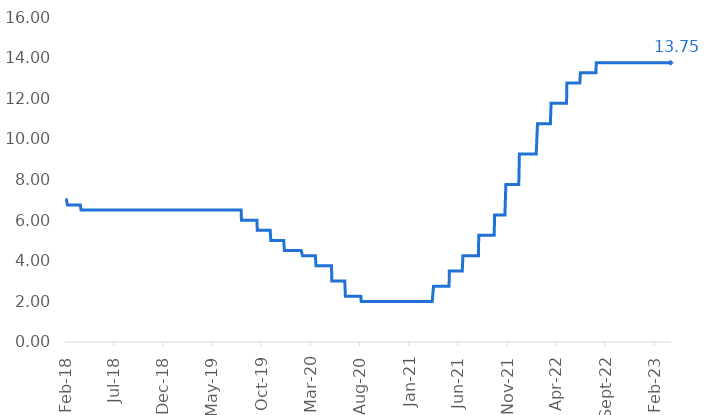
| Category | Selic |
|---|---|
| 2018-02-01 | 7 |
| 2018-02-02 | 7 |
| 2018-02-03 | 7 |
| 2018-02-04 | 7 |
| 2018-02-05 | 7 |
| 2018-02-06 | 7 |
| 2018-02-07 | 7 |
| 2018-02-08 | 6.75 |
| 2018-02-09 | 6.75 |
| 2018-02-10 | 6.75 |
| 2018-02-11 | 6.75 |
| 2018-02-12 | 6.75 |
| 2018-02-13 | 6.75 |
| 2018-02-14 | 6.75 |
| 2018-02-15 | 6.75 |
| 2018-02-16 | 6.75 |
| 2018-02-17 | 6.75 |
| 2018-02-18 | 6.75 |
| 2018-02-19 | 6.75 |
| 2018-02-20 | 6.75 |
| 2018-02-21 | 6.75 |
| 2018-02-22 | 6.75 |
| 2018-02-23 | 6.75 |
| 2018-02-24 | 6.75 |
| 2018-02-25 | 6.75 |
| 2018-02-26 | 6.75 |
| 2018-02-27 | 6.75 |
| 2018-02-28 | 6.75 |
| 2018-03-01 | 6.75 |
| 2018-03-02 | 6.75 |
| 2018-03-03 | 6.75 |
| 2018-03-04 | 6.75 |
| 2018-03-05 | 6.75 |
| 2018-03-06 | 6.75 |
| 2018-03-07 | 6.75 |
| 2018-03-08 | 6.75 |
| 2018-03-09 | 6.75 |
| 2018-03-10 | 6.75 |
| 2018-03-11 | 6.75 |
| 2018-03-12 | 6.75 |
| 2018-03-13 | 6.75 |
| 2018-03-14 | 6.75 |
| 2018-03-15 | 6.75 |
| 2018-03-16 | 6.75 |
| 2018-03-17 | 6.75 |
| 2018-03-18 | 6.75 |
| 2018-03-19 | 6.75 |
| 2018-03-20 | 6.75 |
| 2018-03-21 | 6.75 |
| 2018-03-22 | 6.5 |
| 2018-03-23 | 6.5 |
| 2018-03-24 | 6.5 |
| 2018-03-25 | 6.5 |
| 2018-03-26 | 6.5 |
| 2018-03-27 | 6.5 |
| 2018-03-28 | 6.5 |
| 2018-03-29 | 6.5 |
| 2018-03-30 | 6.5 |
| 2018-03-31 | 6.5 |
| 2018-04-01 | 6.5 |
| 2018-04-02 | 6.5 |
| 2018-04-03 | 6.5 |
| 2018-04-04 | 6.5 |
| 2018-04-05 | 6.5 |
| 2018-04-06 | 6.5 |
| 2018-04-07 | 6.5 |
| 2018-04-08 | 6.5 |
| 2018-04-09 | 6.5 |
| 2018-04-10 | 6.5 |
| 2018-04-11 | 6.5 |
| 2018-04-12 | 6.5 |
| 2018-04-13 | 6.5 |
| 2018-04-14 | 6.5 |
| 2018-04-15 | 6.5 |
| 2018-04-16 | 6.5 |
| 2018-04-17 | 6.5 |
| 2018-04-18 | 6.5 |
| 2018-04-19 | 6.5 |
| 2018-04-20 | 6.5 |
| 2018-04-21 | 6.5 |
| 2018-04-22 | 6.5 |
| 2018-04-23 | 6.5 |
| 2018-04-24 | 6.5 |
| 2018-04-25 | 6.5 |
| 2018-04-26 | 6.5 |
| 2018-04-27 | 6.5 |
| 2018-04-28 | 6.5 |
| 2018-04-29 | 6.5 |
| 2018-04-30 | 6.5 |
| 2018-05-01 | 6.5 |
| 2018-05-02 | 6.5 |
| 2018-05-03 | 6.5 |
| 2018-05-04 | 6.5 |
| 2018-05-05 | 6.5 |
| 2018-05-06 | 6.5 |
| 2018-05-07 | 6.5 |
| 2018-05-08 | 6.5 |
| 2018-05-09 | 6.5 |
| 2018-05-10 | 6.5 |
| 2018-05-11 | 6.5 |
| 2018-05-12 | 6.5 |
| 2018-05-13 | 6.5 |
| 2018-05-14 | 6.5 |
| 2018-05-15 | 6.5 |
| 2018-05-16 | 6.5 |
| 2018-05-17 | 6.5 |
| 2018-05-18 | 6.5 |
| 2018-05-19 | 6.5 |
| 2018-05-20 | 6.5 |
| 2018-05-21 | 6.5 |
| 2018-05-22 | 6.5 |
| 2018-05-23 | 6.5 |
| 2018-05-24 | 6.5 |
| 2018-05-25 | 6.5 |
| 2018-05-26 | 6.5 |
| 2018-05-27 | 6.5 |
| 2018-05-28 | 6.5 |
| 2018-05-29 | 6.5 |
| 2018-05-30 | 6.5 |
| 2018-05-31 | 6.5 |
| 2018-06-01 | 6.5 |
| 2018-06-02 | 6.5 |
| 2018-06-03 | 6.5 |
| 2018-06-04 | 6.5 |
| 2018-06-05 | 6.5 |
| 2018-06-06 | 6.5 |
| 2018-06-07 | 6.5 |
| 2018-06-08 | 6.5 |
| 2018-06-09 | 6.5 |
| 2018-06-10 | 6.5 |
| 2018-06-11 | 6.5 |
| 2018-06-12 | 6.5 |
| 2018-06-13 | 6.5 |
| 2018-06-14 | 6.5 |
| 2018-06-15 | 6.5 |
| 2018-06-16 | 6.5 |
| 2018-06-17 | 6.5 |
| 2018-06-18 | 6.5 |
| 2018-06-19 | 6.5 |
| 2018-06-20 | 6.5 |
| 2018-06-21 | 6.5 |
| 2018-06-22 | 6.5 |
| 2018-06-23 | 6.5 |
| 2018-06-24 | 6.5 |
| 2018-06-25 | 6.5 |
| 2018-06-26 | 6.5 |
| 2018-06-27 | 6.5 |
| 2018-06-28 | 6.5 |
| 2018-06-29 | 6.5 |
| 2018-06-30 | 6.5 |
| 2018-07-01 | 6.5 |
| 2018-07-02 | 6.5 |
| 2018-07-03 | 6.5 |
| 2018-07-04 | 6.5 |
| 2018-07-05 | 6.5 |
| 2018-07-06 | 6.5 |
| 2018-07-07 | 6.5 |
| 2018-07-08 | 6.5 |
| 2018-07-09 | 6.5 |
| 2018-07-10 | 6.5 |
| 2018-07-11 | 6.5 |
| 2018-07-12 | 6.5 |
| 2018-07-13 | 6.5 |
| 2018-07-14 | 6.5 |
| 2018-07-15 | 6.5 |
| 2018-07-16 | 6.5 |
| 2018-07-17 | 6.5 |
| 2018-07-18 | 6.5 |
| 2018-07-19 | 6.5 |
| 2018-07-20 | 6.5 |
| 2018-07-21 | 6.5 |
| 2018-07-22 | 6.5 |
| 2018-07-23 | 6.5 |
| 2018-07-24 | 6.5 |
| 2018-07-25 | 6.5 |
| 2018-07-26 | 6.5 |
| 2018-07-27 | 6.5 |
| 2018-07-28 | 6.5 |
| 2018-07-29 | 6.5 |
| 2018-07-30 | 6.5 |
| 2018-07-31 | 6.5 |
| 2018-08-01 | 6.5 |
| 2018-08-02 | 6.5 |
| 2018-08-03 | 6.5 |
| 2018-08-04 | 6.5 |
| 2018-08-05 | 6.5 |
| 2018-08-06 | 6.5 |
| 2018-08-07 | 6.5 |
| 2018-08-08 | 6.5 |
| 2018-08-09 | 6.5 |
| 2018-08-10 | 6.5 |
| 2018-08-11 | 6.5 |
| 2018-08-12 | 6.5 |
| 2018-08-13 | 6.5 |
| 2018-08-14 | 6.5 |
| 2018-08-15 | 6.5 |
| 2018-08-16 | 6.5 |
| 2018-08-17 | 6.5 |
| 2018-08-18 | 6.5 |
| 2018-08-19 | 6.5 |
| 2018-08-20 | 6.5 |
| 2018-08-21 | 6.5 |
| 2018-08-22 | 6.5 |
| 2018-08-23 | 6.5 |
| 2018-08-24 | 6.5 |
| 2018-08-25 | 6.5 |
| 2018-08-26 | 6.5 |
| 2018-08-27 | 6.5 |
| 2018-08-28 | 6.5 |
| 2018-08-29 | 6.5 |
| 2018-08-30 | 6.5 |
| 2018-08-31 | 6.5 |
| 2018-09-01 | 6.5 |
| 2018-09-02 | 6.5 |
| 2018-09-03 | 6.5 |
| 2018-09-04 | 6.5 |
| 2018-09-05 | 6.5 |
| 2018-09-06 | 6.5 |
| 2018-09-07 | 6.5 |
| 2018-09-08 | 6.5 |
| 2018-09-09 | 6.5 |
| 2018-09-10 | 6.5 |
| 2018-09-11 | 6.5 |
| 2018-09-12 | 6.5 |
| 2018-09-13 | 6.5 |
| 2018-09-14 | 6.5 |
| 2018-09-15 | 6.5 |
| 2018-09-16 | 6.5 |
| 2018-09-17 | 6.5 |
| 2018-09-18 | 6.5 |
| 2018-09-19 | 6.5 |
| 2018-09-20 | 6.5 |
| 2018-09-21 | 6.5 |
| 2018-09-22 | 6.5 |
| 2018-09-23 | 6.5 |
| 2018-09-24 | 6.5 |
| 2018-09-25 | 6.5 |
| 2018-09-26 | 6.5 |
| 2018-09-27 | 6.5 |
| 2018-09-28 | 6.5 |
| 2018-09-29 | 6.5 |
| 2018-09-30 | 6.5 |
| 2018-10-01 | 6.5 |
| 2018-10-02 | 6.5 |
| 2018-10-03 | 6.5 |
| 2018-10-04 | 6.5 |
| 2018-10-05 | 6.5 |
| 2018-10-06 | 6.5 |
| 2018-10-07 | 6.5 |
| 2018-10-08 | 6.5 |
| 2018-10-09 | 6.5 |
| 2018-10-10 | 6.5 |
| 2018-10-11 | 6.5 |
| 2018-10-12 | 6.5 |
| 2018-10-13 | 6.5 |
| 2018-10-14 | 6.5 |
| 2018-10-15 | 6.5 |
| 2018-10-16 | 6.5 |
| 2018-10-17 | 6.5 |
| 2018-10-18 | 6.5 |
| 2018-10-19 | 6.5 |
| 2018-10-20 | 6.5 |
| 2018-10-21 | 6.5 |
| 2018-10-22 | 6.5 |
| 2018-10-23 | 6.5 |
| 2018-10-24 | 6.5 |
| 2018-10-25 | 6.5 |
| 2018-10-26 | 6.5 |
| 2018-10-27 | 6.5 |
| 2018-10-28 | 6.5 |
| 2018-10-29 | 6.5 |
| 2018-10-30 | 6.5 |
| 2018-10-31 | 6.5 |
| 2018-11-01 | 6.5 |
| 2018-11-02 | 6.5 |
| 2018-11-03 | 6.5 |
| 2018-11-04 | 6.5 |
| 2018-11-05 | 6.5 |
| 2018-11-06 | 6.5 |
| 2018-11-07 | 6.5 |
| 2018-11-08 | 6.5 |
| 2018-11-09 | 6.5 |
| 2018-11-10 | 6.5 |
| 2018-11-11 | 6.5 |
| 2018-11-12 | 6.5 |
| 2018-11-13 | 6.5 |
| 2018-11-14 | 6.5 |
| 2018-11-15 | 6.5 |
| 2018-11-16 | 6.5 |
| 2018-11-17 | 6.5 |
| 2018-11-18 | 6.5 |
| 2018-11-19 | 6.5 |
| 2018-11-20 | 6.5 |
| 2018-11-21 | 6.5 |
| 2018-11-22 | 6.5 |
| 2018-11-23 | 6.5 |
| 2018-11-24 | 6.5 |
| 2018-11-25 | 6.5 |
| 2018-11-26 | 6.5 |
| 2018-11-27 | 6.5 |
| 2018-11-28 | 6.5 |
| 2018-11-29 | 6.5 |
| 2018-11-30 | 6.5 |
| 2018-12-01 | 6.5 |
| 2018-12-02 | 6.5 |
| 2018-12-03 | 6.5 |
| 2018-12-04 | 6.5 |
| 2018-12-05 | 6.5 |
| 2018-12-06 | 6.5 |
| 2018-12-07 | 6.5 |
| 2018-12-08 | 6.5 |
| 2018-12-09 | 6.5 |
| 2018-12-10 | 6.5 |
| 2018-12-11 | 6.5 |
| 2018-12-12 | 6.5 |
| 2018-12-13 | 6.5 |
| 2018-12-14 | 6.5 |
| 2018-12-15 | 6.5 |
| 2018-12-16 | 6.5 |
| 2018-12-17 | 6.5 |
| 2018-12-18 | 6.5 |
| 2018-12-19 | 6.5 |
| 2018-12-20 | 6.5 |
| 2018-12-21 | 6.5 |
| 2018-12-22 | 6.5 |
| 2018-12-23 | 6.5 |
| 2018-12-24 | 6.5 |
| 2018-12-25 | 6.5 |
| 2018-12-26 | 6.5 |
| 2018-12-27 | 6.5 |
| 2018-12-28 | 6.5 |
| 2018-12-29 | 6.5 |
| 2018-12-30 | 6.5 |
| 2018-12-31 | 6.5 |
| 2019-01-01 | 6.5 |
| 2019-01-02 | 6.5 |
| 2019-01-03 | 6.5 |
| 2019-01-04 | 6.5 |
| 2019-01-05 | 6.5 |
| 2019-01-06 | 6.5 |
| 2019-01-07 | 6.5 |
| 2019-01-08 | 6.5 |
| 2019-01-09 | 6.5 |
| 2019-01-10 | 6.5 |
| 2019-01-11 | 6.5 |
| 2019-01-12 | 6.5 |
| 2019-01-13 | 6.5 |
| 2019-01-14 | 6.5 |
| 2019-01-15 | 6.5 |
| 2019-01-16 | 6.5 |
| 2019-01-17 | 6.5 |
| 2019-01-18 | 6.5 |
| 2019-01-19 | 6.5 |
| 2019-01-20 | 6.5 |
| 2019-01-21 | 6.5 |
| 2019-01-22 | 6.5 |
| 2019-01-23 | 6.5 |
| 2019-01-24 | 6.5 |
| 2019-01-25 | 6.5 |
| 2019-01-26 | 6.5 |
| 2019-01-27 | 6.5 |
| 2019-01-28 | 6.5 |
| 2019-01-29 | 6.5 |
| 2019-01-30 | 6.5 |
| 2019-01-31 | 6.5 |
| 2019-02-01 | 6.5 |
| 2019-02-02 | 6.5 |
| 2019-02-03 | 6.5 |
| 2019-02-04 | 6.5 |
| 2019-02-05 | 6.5 |
| 2019-02-06 | 6.5 |
| 2019-02-07 | 6.5 |
| 2019-02-08 | 6.5 |
| 2019-02-09 | 6.5 |
| 2019-02-10 | 6.5 |
| 2019-02-11 | 6.5 |
| 2019-02-12 | 6.5 |
| 2019-02-13 | 6.5 |
| 2019-02-14 | 6.5 |
| 2019-02-15 | 6.5 |
| 2019-02-16 | 6.5 |
| 2019-02-17 | 6.5 |
| 2019-02-18 | 6.5 |
| 2019-02-19 | 6.5 |
| 2019-02-20 | 6.5 |
| 2019-02-21 | 6.5 |
| 2019-02-22 | 6.5 |
| 2019-02-23 | 6.5 |
| 2019-02-24 | 6.5 |
| 2019-02-25 | 6.5 |
| 2019-02-26 | 6.5 |
| 2019-02-27 | 6.5 |
| 2019-02-28 | 6.5 |
| 2019-03-01 | 6.5 |
| 2019-03-02 | 6.5 |
| 2019-03-03 | 6.5 |
| 2019-03-04 | 6.5 |
| 2019-03-05 | 6.5 |
| 2019-03-06 | 6.5 |
| 2019-03-07 | 6.5 |
| 2019-03-08 | 6.5 |
| 2019-03-09 | 6.5 |
| 2019-03-10 | 6.5 |
| 2019-03-11 | 6.5 |
| 2019-03-12 | 6.5 |
| 2019-03-13 | 6.5 |
| 2019-03-14 | 6.5 |
| 2019-03-15 | 6.5 |
| 2019-03-16 | 6.5 |
| 2019-03-17 | 6.5 |
| 2019-03-18 | 6.5 |
| 2019-03-19 | 6.5 |
| 2019-03-20 | 6.5 |
| 2019-03-21 | 6.5 |
| 2019-03-22 | 6.5 |
| 2019-03-23 | 6.5 |
| 2019-03-24 | 6.5 |
| 2019-03-25 | 6.5 |
| 2019-03-26 | 6.5 |
| 2019-03-27 | 6.5 |
| 2019-03-28 | 6.5 |
| 2019-03-29 | 6.5 |
| 2019-03-30 | 6.5 |
| 2019-03-31 | 6.5 |
| 2019-04-01 | 6.5 |
| 2019-04-02 | 6.5 |
| 2019-04-03 | 6.5 |
| 2019-04-04 | 6.5 |
| 2019-04-05 | 6.5 |
| 2019-04-06 | 6.5 |
| 2019-04-07 | 6.5 |
| 2019-04-08 | 6.5 |
| 2019-04-09 | 6.5 |
| 2019-04-10 | 6.5 |
| 2019-04-11 | 6.5 |
| 2019-04-12 | 6.5 |
| 2019-04-13 | 6.5 |
| 2019-04-14 | 6.5 |
| 2019-04-15 | 6.5 |
| 2019-04-16 | 6.5 |
| 2019-04-17 | 6.5 |
| 2019-04-18 | 6.5 |
| 2019-04-19 | 6.5 |
| 2019-04-20 | 6.5 |
| 2019-04-21 | 6.5 |
| 2019-04-22 | 6.5 |
| 2019-04-23 | 6.5 |
| 2019-04-24 | 6.5 |
| 2019-04-25 | 6.5 |
| 2019-04-26 | 6.5 |
| 2019-04-27 | 6.5 |
| 2019-04-28 | 6.5 |
| 2019-04-29 | 6.5 |
| 2019-04-30 | 6.5 |
| 2019-05-01 | 6.5 |
| 2019-05-02 | 6.5 |
| 2019-05-03 | 6.5 |
| 2019-05-04 | 6.5 |
| 2019-05-05 | 6.5 |
| 2019-05-06 | 6.5 |
| 2019-05-07 | 6.5 |
| 2019-05-08 | 6.5 |
| 2019-05-09 | 6.5 |
| 2019-05-10 | 6.5 |
| 2019-05-11 | 6.5 |
| 2019-05-12 | 6.5 |
| 2019-05-13 | 6.5 |
| 2019-05-14 | 6.5 |
| 2019-05-15 | 6.5 |
| 2019-05-16 | 6.5 |
| 2019-05-17 | 6.5 |
| 2019-05-18 | 6.5 |
| 2019-05-19 | 6.5 |
| 2019-05-20 | 6.5 |
| 2019-05-21 | 6.5 |
| 2019-05-22 | 6.5 |
| 2019-05-23 | 6.5 |
| 2019-05-24 | 6.5 |
| 2019-05-25 | 6.5 |
| 2019-05-26 | 6.5 |
| 2019-05-27 | 6.5 |
| 2019-05-28 | 6.5 |
| 2019-05-29 | 6.5 |
| 2019-05-30 | 6.5 |
| 2019-05-31 | 6.5 |
| 2019-06-01 | 6.5 |
| 2019-06-02 | 6.5 |
| 2019-06-03 | 6.5 |
| 2019-06-04 | 6.5 |
| 2019-06-05 | 6.5 |
| 2019-06-06 | 6.5 |
| 2019-06-07 | 6.5 |
| 2019-06-08 | 6.5 |
| 2019-06-09 | 6.5 |
| 2019-06-10 | 6.5 |
| 2019-06-11 | 6.5 |
| 2019-06-12 | 6.5 |
| 2019-06-13 | 6.5 |
| 2019-06-14 | 6.5 |
| 2019-06-15 | 6.5 |
| 2019-06-16 | 6.5 |
| 2019-06-17 | 6.5 |
| 2019-06-18 | 6.5 |
| 2019-06-19 | 6.5 |
| 2019-06-20 | 6.5 |
| 2019-06-21 | 6.5 |
| 2019-06-22 | 6.5 |
| 2019-06-23 | 6.5 |
| 2019-06-24 | 6.5 |
| 2019-06-25 | 6.5 |
| 2019-06-26 | 6.5 |
| 2019-06-27 | 6.5 |
| 2019-06-28 | 6.5 |
| 2019-06-29 | 6.5 |
| 2019-06-30 | 6.5 |
| 2019-07-01 | 6.5 |
| 2019-07-02 | 6.5 |
| 2019-07-03 | 6.5 |
| 2019-07-04 | 6.5 |
| 2019-07-05 | 6.5 |
| 2019-07-06 | 6.5 |
| 2019-07-07 | 6.5 |
| 2019-07-08 | 6.5 |
| 2019-07-09 | 6.5 |
| 2019-07-10 | 6.5 |
| 2019-07-11 | 6.5 |
| 2019-07-12 | 6.5 |
| 2019-07-13 | 6.5 |
| 2019-07-14 | 6.5 |
| 2019-07-15 | 6.5 |
| 2019-07-16 | 6.5 |
| 2019-07-17 | 6.5 |
| 2019-07-18 | 6.5 |
| 2019-07-19 | 6.5 |
| 2019-07-20 | 6.5 |
| 2019-07-21 | 6.5 |
| 2019-07-22 | 6.5 |
| 2019-07-23 | 6.5 |
| 2019-07-24 | 6.5 |
| 2019-07-25 | 6.5 |
| 2019-07-26 | 6.5 |
| 2019-07-27 | 6.5 |
| 2019-07-28 | 6.5 |
| 2019-07-29 | 6.5 |
| 2019-07-30 | 6.5 |
| 2019-07-31 | 6.5 |
| 2019-08-01 | 6 |
| 2019-08-02 | 6 |
| 2019-08-03 | 6 |
| 2019-08-04 | 6 |
| 2019-08-05 | 6 |
| 2019-08-06 | 6 |
| 2019-08-07 | 6 |
| 2019-08-08 | 6 |
| 2019-08-09 | 6 |
| 2019-08-10 | 6 |
| 2019-08-11 | 6 |
| 2019-08-12 | 6 |
| 2019-08-13 | 6 |
| 2019-08-14 | 6 |
| 2019-08-15 | 6 |
| 2019-08-16 | 6 |
| 2019-08-17 | 6 |
| 2019-08-18 | 6 |
| 2019-08-19 | 6 |
| 2019-08-20 | 6 |
| 2019-08-21 | 6 |
| 2019-08-22 | 6 |
| 2019-08-23 | 6 |
| 2019-08-24 | 6 |
| 2019-08-25 | 6 |
| 2019-08-26 | 6 |
| 2019-08-27 | 6 |
| 2019-08-28 | 6 |
| 2019-08-29 | 6 |
| 2019-08-30 | 6 |
| 2019-08-31 | 6 |
| 2019-09-01 | 6 |
| 2019-09-02 | 6 |
| 2019-09-03 | 6 |
| 2019-09-04 | 6 |
| 2019-09-05 | 6 |
| 2019-09-06 | 6 |
| 2019-09-07 | 6 |
| 2019-09-08 | 6 |
| 2019-09-09 | 6 |
| 2019-09-10 | 6 |
| 2019-09-11 | 6 |
| 2019-09-12 | 6 |
| 2019-09-13 | 6 |
| 2019-09-14 | 6 |
| 2019-09-15 | 6 |
| 2019-09-16 | 6 |
| 2019-09-17 | 6 |
| 2019-09-18 | 6 |
| 2019-09-19 | 5.5 |
| 2019-09-20 | 5.5 |
| 2019-09-21 | 5.5 |
| 2019-09-22 | 5.5 |
| 2019-09-23 | 5.5 |
| 2019-09-24 | 5.5 |
| 2019-09-25 | 5.5 |
| 2019-09-26 | 5.5 |
| 2019-09-27 | 5.5 |
| 2019-09-28 | 5.5 |
| 2019-09-29 | 5.5 |
| 2019-09-30 | 5.5 |
| 2019-10-01 | 5.5 |
| 2019-10-02 | 5.5 |
| 2019-10-03 | 5.5 |
| 2019-10-04 | 5.5 |
| 2019-10-05 | 5.5 |
| 2019-10-06 | 5.5 |
| 2019-10-07 | 5.5 |
| 2019-10-08 | 5.5 |
| 2019-10-09 | 5.5 |
| 2019-10-10 | 5.5 |
| 2019-10-11 | 5.5 |
| 2019-10-12 | 5.5 |
| 2019-10-13 | 5.5 |
| 2019-10-14 | 5.5 |
| 2019-10-15 | 5.5 |
| 2019-10-16 | 5.5 |
| 2019-10-17 | 5.5 |
| 2019-10-18 | 5.5 |
| 2019-10-19 | 5.5 |
| 2019-10-20 | 5.5 |
| 2019-10-21 | 5.5 |
| 2019-10-22 | 5.5 |
| 2019-10-23 | 5.5 |
| 2019-10-24 | 5.5 |
| 2019-10-25 | 5.5 |
| 2019-10-26 | 5.5 |
| 2019-10-27 | 5.5 |
| 2019-10-28 | 5.5 |
| 2019-10-29 | 5.5 |
| 2019-10-30 | 5.5 |
| 2019-10-31 | 5 |
| 2019-11-01 | 5 |
| 2019-11-02 | 5 |
| 2019-11-03 | 5 |
| 2019-11-04 | 5 |
| 2019-11-05 | 5 |
| 2019-11-06 | 5 |
| 2019-11-07 | 5 |
| 2019-11-08 | 5 |
| 2019-11-09 | 5 |
| 2019-11-10 | 5 |
| 2019-11-11 | 5 |
| 2019-11-12 | 5 |
| 2019-11-13 | 5 |
| 2019-11-14 | 5 |
| 2019-11-15 | 5 |
| 2019-11-16 | 5 |
| 2019-11-17 | 5 |
| 2019-11-18 | 5 |
| 2019-11-19 | 5 |
| 2019-11-20 | 5 |
| 2019-11-21 | 5 |
| 2019-11-22 | 5 |
| 2019-11-23 | 5 |
| 2019-11-24 | 5 |
| 2019-11-25 | 5 |
| 2019-11-26 | 5 |
| 2019-11-27 | 5 |
| 2019-11-28 | 5 |
| 2019-11-29 | 5 |
| 2019-11-30 | 5 |
| 2019-12-01 | 5 |
| 2019-12-02 | 5 |
| 2019-12-03 | 5 |
| 2019-12-04 | 5 |
| 2019-12-05 | 5 |
| 2019-12-06 | 5 |
| 2019-12-07 | 5 |
| 2019-12-08 | 5 |
| 2019-12-09 | 5 |
| 2019-12-10 | 5 |
| 2019-12-11 | 5 |
| 2019-12-12 | 4.5 |
| 2019-12-13 | 4.5 |
| 2019-12-14 | 4.5 |
| 2019-12-15 | 4.5 |
| 2019-12-16 | 4.5 |
| 2019-12-17 | 4.5 |
| 2019-12-18 | 4.5 |
| 2019-12-19 | 4.5 |
| 2019-12-20 | 4.5 |
| 2019-12-21 | 4.5 |
| 2019-12-22 | 4.5 |
| 2019-12-23 | 4.5 |
| 2019-12-24 | 4.5 |
| 2019-12-25 | 4.5 |
| 2019-12-26 | 4.5 |
| 2019-12-27 | 4.5 |
| 2019-12-28 | 4.5 |
| 2019-12-29 | 4.5 |
| 2019-12-30 | 4.5 |
| 2019-12-31 | 4.5 |
| 2020-01-01 | 4.5 |
| 2020-01-02 | 4.5 |
| 2020-01-03 | 4.5 |
| 2020-01-04 | 4.5 |
| 2020-01-05 | 4.5 |
| 2020-01-06 | 4.5 |
| 2020-01-07 | 4.5 |
| 2020-01-08 | 4.5 |
| 2020-01-09 | 4.5 |
| 2020-01-10 | 4.5 |
| 2020-01-11 | 4.5 |
| 2020-01-12 | 4.5 |
| 2020-01-13 | 4.5 |
| 2020-01-14 | 4.5 |
| 2020-01-15 | 4.5 |
| 2020-01-16 | 4.5 |
| 2020-01-17 | 4.5 |
| 2020-01-18 | 4.5 |
| 2020-01-19 | 4.5 |
| 2020-01-20 | 4.5 |
| 2020-01-21 | 4.5 |
| 2020-01-22 | 4.5 |
| 2020-01-23 | 4.5 |
| 2020-01-24 | 4.5 |
| 2020-01-25 | 4.5 |
| 2020-01-26 | 4.5 |
| 2020-01-27 | 4.5 |
| 2020-01-28 | 4.5 |
| 2020-01-29 | 4.5 |
| 2020-01-30 | 4.5 |
| 2020-01-31 | 4.5 |
| 2020-02-01 | 4.5 |
| 2020-02-02 | 4.5 |
| 2020-02-03 | 4.5 |
| 2020-02-04 | 4.5 |
| 2020-02-05 | 4.5 |
| 2020-02-06 | 4.25 |
| 2020-02-07 | 4.25 |
| 2020-02-08 | 4.25 |
| 2020-02-09 | 4.25 |
| 2020-02-10 | 4.25 |
| 2020-02-11 | 4.25 |
| 2020-02-12 | 4.25 |
| 2020-02-13 | 4.25 |
| 2020-02-14 | 4.25 |
| 2020-02-15 | 4.25 |
| 2020-02-16 | 4.25 |
| 2020-02-17 | 4.25 |
| 2020-02-18 | 4.25 |
| 2020-02-19 | 4.25 |
| 2020-02-20 | 4.25 |
| 2020-02-21 | 4.25 |
| 2020-02-22 | 4.25 |
| 2020-02-23 | 4.25 |
| 2020-02-24 | 4.25 |
| 2020-02-25 | 4.25 |
| 2020-02-26 | 4.25 |
| 2020-02-27 | 4.25 |
| 2020-02-28 | 4.25 |
| 2020-02-29 | 4.25 |
| 2020-03-01 | 4.25 |
| 2020-03-02 | 4.25 |
| 2020-03-03 | 4.25 |
| 2020-03-04 | 4.25 |
| 2020-03-05 | 4.25 |
| 2020-03-06 | 4.25 |
| 2020-03-07 | 4.25 |
| 2020-03-08 | 4.25 |
| 2020-03-09 | 4.25 |
| 2020-03-10 | 4.25 |
| 2020-03-11 | 4.25 |
| 2020-03-12 | 4.25 |
| 2020-03-13 | 4.25 |
| 2020-03-14 | 4.25 |
| 2020-03-15 | 4.25 |
| 2020-03-16 | 4.25 |
| 2020-03-17 | 4.25 |
| 2020-03-18 | 4.25 |
| 2020-03-19 | 3.75 |
| 2020-03-20 | 3.75 |
| 2020-03-21 | 3.75 |
| 2020-03-22 | 3.75 |
| 2020-03-23 | 3.75 |
| 2020-03-24 | 3.75 |
| 2020-03-25 | 3.75 |
| 2020-03-26 | 3.75 |
| 2020-03-27 | 3.75 |
| 2020-03-28 | 3.75 |
| 2020-03-29 | 3.75 |
| 2020-03-30 | 3.75 |
| 2020-03-31 | 3.75 |
| 2020-04-01 | 3.75 |
| 2020-04-02 | 3.75 |
| 2020-04-03 | 3.75 |
| 2020-04-04 | 3.75 |
| 2020-04-05 | 3.75 |
| 2020-04-06 | 3.75 |
| 2020-04-07 | 3.75 |
| 2020-04-08 | 3.75 |
| 2020-04-09 | 3.75 |
| 2020-04-10 | 3.75 |
| 2020-04-11 | 3.75 |
| 2020-04-12 | 3.75 |
| 2020-04-13 | 3.75 |
| 2020-04-14 | 3.75 |
| 2020-04-15 | 3.75 |
| 2020-04-16 | 3.75 |
| 2020-04-17 | 3.75 |
| 2020-04-18 | 3.75 |
| 2020-04-19 | 3.75 |
| 2020-04-20 | 3.75 |
| 2020-04-21 | 3.75 |
| 2020-04-22 | 3.75 |
| 2020-04-23 | 3.75 |
| 2020-04-24 | 3.75 |
| 2020-04-25 | 3.75 |
| 2020-04-26 | 3.75 |
| 2020-04-27 | 3.75 |
| 2020-04-28 | 3.75 |
| 2020-04-29 | 3.75 |
| 2020-04-30 | 3.75 |
| 2020-05-01 | 3.75 |
| 2020-05-02 | 3.75 |
| 2020-05-03 | 3.75 |
| 2020-05-04 | 3.75 |
| 2020-05-05 | 3.75 |
| 2020-05-06 | 3.75 |
| 2020-05-07 | 3 |
| 2020-05-08 | 3 |
| 2020-05-09 | 3 |
| 2020-05-10 | 3 |
| 2020-05-11 | 3 |
| 2020-05-12 | 3 |
| 2020-05-13 | 3 |
| 2020-05-14 | 3 |
| 2020-05-15 | 3 |
| 2020-05-16 | 3 |
| 2020-05-17 | 3 |
| 2020-05-18 | 3 |
| 2020-05-19 | 3 |
| 2020-05-20 | 3 |
| 2020-05-21 | 3 |
| 2020-05-22 | 3 |
| 2020-05-23 | 3 |
| 2020-05-24 | 3 |
| 2020-05-25 | 3 |
| 2020-05-26 | 3 |
| 2020-05-27 | 3 |
| 2020-05-28 | 3 |
| 2020-05-29 | 3 |
| 2020-05-30 | 3 |
| 2020-05-31 | 3 |
| 2020-06-01 | 3 |
| 2020-06-02 | 3 |
| 2020-06-03 | 3 |
| 2020-06-04 | 3 |
| 2020-06-05 | 3 |
| 2020-06-06 | 3 |
| 2020-06-07 | 3 |
| 2020-06-08 | 3 |
| 2020-06-09 | 3 |
| 2020-06-10 | 3 |
| 2020-06-11 | 3 |
| 2020-06-12 | 3 |
| 2020-06-13 | 3 |
| 2020-06-14 | 3 |
| 2020-06-15 | 3 |
| 2020-06-16 | 3 |
| 2020-06-17 | 3 |
| 2020-06-18 | 2.25 |
| 2020-06-19 | 2.25 |
| 2020-06-20 | 2.25 |
| 2020-06-21 | 2.25 |
| 2020-06-22 | 2.25 |
| 2020-06-23 | 2.25 |
| 2020-06-24 | 2.25 |
| 2020-06-25 | 2.25 |
| 2020-06-26 | 2.25 |
| 2020-06-27 | 2.25 |
| 2020-06-28 | 2.25 |
| 2020-06-29 | 2.25 |
| 2020-06-30 | 2.25 |
| 2020-07-01 | 2.25 |
| 2020-07-02 | 2.25 |
| 2020-07-03 | 2.25 |
| 2020-07-04 | 2.25 |
| 2020-07-05 | 2.25 |
| 2020-07-06 | 2.25 |
| 2020-07-07 | 2.25 |
| 2020-07-08 | 2.25 |
| 2020-07-09 | 2.25 |
| 2020-07-10 | 2.25 |
| 2020-07-11 | 2.25 |
| 2020-07-12 | 2.25 |
| 2020-07-13 | 2.25 |
| 2020-07-14 | 2.25 |
| 2020-07-15 | 2.25 |
| 2020-07-16 | 2.25 |
| 2020-07-17 | 2.25 |
| 2020-07-18 | 2.25 |
| 2020-07-19 | 2.25 |
| 2020-07-20 | 2.25 |
| 2020-07-21 | 2.25 |
| 2020-07-22 | 2.25 |
| 2020-07-23 | 2.25 |
| 2020-07-24 | 2.25 |
| 2020-07-25 | 2.25 |
| 2020-07-26 | 2.25 |
| 2020-07-27 | 2.25 |
| 2020-07-28 | 2.25 |
| 2020-07-29 | 2.25 |
| 2020-07-30 | 2.25 |
| 2020-07-31 | 2.25 |
| 2020-08-01 | 2.25 |
| 2020-08-02 | 2.25 |
| 2020-08-03 | 2.25 |
| 2020-08-04 | 2.25 |
| 2020-08-05 | 2.25 |
| 2020-08-06 | 2 |
| 2020-08-07 | 2 |
| 2020-08-08 | 2 |
| 2020-08-09 | 2 |
| 2020-08-10 | 2 |
| 2020-08-11 | 2 |
| 2020-08-12 | 2 |
| 2020-08-13 | 2 |
| 2020-08-14 | 2 |
| 2020-08-15 | 2 |
| 2020-08-16 | 2 |
| 2020-08-17 | 2 |
| 2020-08-18 | 2 |
| 2020-08-19 | 2 |
| 2020-08-20 | 2 |
| 2020-08-21 | 2 |
| 2020-08-22 | 2 |
| 2020-08-23 | 2 |
| 2020-08-24 | 2 |
| 2020-08-25 | 2 |
| 2020-08-26 | 2 |
| 2020-08-27 | 2 |
| 2020-08-28 | 2 |
| 2020-08-29 | 2 |
| 2020-08-30 | 2 |
| 2020-08-31 | 2 |
| 2020-09-01 | 2 |
| 2020-09-02 | 2 |
| 2020-09-03 | 2 |
| 2020-09-04 | 2 |
| 2020-09-05 | 2 |
| 2020-09-06 | 2 |
| 2020-09-07 | 2 |
| 2020-09-08 | 2 |
| 2020-09-09 | 2 |
| 2020-09-10 | 2 |
| 2020-09-11 | 2 |
| 2020-09-12 | 2 |
| 2020-09-13 | 2 |
| 2020-09-14 | 2 |
| 2020-09-15 | 2 |
| 2020-09-16 | 2 |
| 2020-09-17 | 2 |
| 2020-09-18 | 2 |
| 2020-09-19 | 2 |
| 2020-09-20 | 2 |
| 2020-09-21 | 2 |
| 2020-09-22 | 2 |
| 2020-09-23 | 2 |
| 2020-09-24 | 2 |
| 2020-09-25 | 2 |
| 2020-09-26 | 2 |
| 2020-09-27 | 2 |
| 2020-09-28 | 2 |
| 2020-09-29 | 2 |
| 2020-09-30 | 2 |
| 2020-10-01 | 2 |
| 2020-10-02 | 2 |
| 2020-10-03 | 2 |
| 2020-10-04 | 2 |
| 2020-10-05 | 2 |
| 2020-10-06 | 2 |
| 2020-10-07 | 2 |
| 2020-10-08 | 2 |
| 2020-10-09 | 2 |
| 2020-10-10 | 2 |
| 2020-10-11 | 2 |
| 2020-10-12 | 2 |
| 2020-10-13 | 2 |
| 2020-10-14 | 2 |
| 2020-10-15 | 2 |
| 2020-10-16 | 2 |
| 2020-10-17 | 2 |
| 2020-10-18 | 2 |
| 2020-10-19 | 2 |
| 2020-10-20 | 2 |
| 2020-10-21 | 2 |
| 2020-10-22 | 2 |
| 2020-10-23 | 2 |
| 2020-10-24 | 2 |
| 2020-10-25 | 2 |
| 2020-10-26 | 2 |
| 2020-10-27 | 2 |
| 2020-10-28 | 2 |
| 2020-10-29 | 2 |
| 2020-10-30 | 2 |
| 2020-10-31 | 2 |
| 2020-11-01 | 2 |
| 2020-11-02 | 2 |
| 2020-11-03 | 2 |
| 2020-11-04 | 2 |
| 2020-11-05 | 2 |
| 2020-11-06 | 2 |
| 2020-11-07 | 2 |
| 2020-11-08 | 2 |
| 2020-11-09 | 2 |
| 2020-11-10 | 2 |
| 2020-11-11 | 2 |
| 2020-11-12 | 2 |
| 2020-11-13 | 2 |
| 2020-11-14 | 2 |
| 2020-11-15 | 2 |
| 2020-11-16 | 2 |
| 2020-11-17 | 2 |
| 2020-11-18 | 2 |
| 2020-11-19 | 2 |
| 2020-11-20 | 2 |
| 2020-11-21 | 2 |
| 2020-11-22 | 2 |
| 2020-11-23 | 2 |
| 2020-11-24 | 2 |
| 2020-11-25 | 2 |
| 2020-11-26 | 2 |
| 2020-11-27 | 2 |
| 2020-11-28 | 2 |
| 2020-11-29 | 2 |
| 2020-11-30 | 2 |
| 2020-12-01 | 2 |
| 2020-12-02 | 2 |
| 2020-12-03 | 2 |
| 2020-12-04 | 2 |
| 2020-12-05 | 2 |
| 2020-12-06 | 2 |
| 2020-12-07 | 2 |
| 2020-12-08 | 2 |
| 2020-12-09 | 2 |
| 2020-12-10 | 2 |
| 2020-12-11 | 2 |
| 2020-12-12 | 2 |
| 2020-12-13 | 2 |
| 2020-12-14 | 2 |
| 2020-12-15 | 2 |
| 2020-12-16 | 2 |
| 2020-12-17 | 2 |
| 2020-12-18 | 2 |
| 2020-12-19 | 2 |
| 2020-12-20 | 2 |
| 2020-12-21 | 2 |
| 2020-12-22 | 2 |
| 2020-12-23 | 2 |
| 2020-12-24 | 2 |
| 2020-12-25 | 2 |
| 2020-12-26 | 2 |
| 2020-12-27 | 2 |
| 2020-12-28 | 2 |
| 2020-12-29 | 2 |
| 2020-12-30 | 2 |
| 2020-12-31 | 2 |
| 2021-01-01 | 2 |
| 2021-01-02 | 2 |
| 2021-01-03 | 2 |
| 2021-01-04 | 2 |
| 2021-01-05 | 2 |
| 2021-01-06 | 2 |
| 2021-01-07 | 2 |
| 2021-01-08 | 2 |
| 2021-01-09 | 2 |
| 2021-01-10 | 2 |
| 2021-01-11 | 2 |
| 2021-01-12 | 2 |
| 2021-01-13 | 2 |
| 2021-01-14 | 2 |
| 2021-01-15 | 2 |
| 2021-01-16 | 2 |
| 2021-01-17 | 2 |
| 2021-01-18 | 2 |
| 2021-01-19 | 2 |
| 2021-01-20 | 2 |
| 2021-01-21 | 2 |
| 2021-01-22 | 2 |
| 2021-01-23 | 2 |
| 2021-01-24 | 2 |
| 2021-01-25 | 2 |
| 2021-01-26 | 2 |
| 2021-01-27 | 2 |
| 2021-01-28 | 2 |
| 2021-01-29 | 2 |
| 2021-01-30 | 2 |
| 2021-01-31 | 2 |
| 2021-02-01 | 2 |
| 2021-02-02 | 2 |
| 2021-02-03 | 2 |
| 2021-02-04 | 2 |
| 2021-02-05 | 2 |
| 2021-02-06 | 2 |
| 2021-02-07 | 2 |
| 2021-02-08 | 2 |
| 2021-02-09 | 2 |
| 2021-02-10 | 2 |
| 2021-02-11 | 2 |
| 2021-02-12 | 2 |
| 2021-02-13 | 2 |
| 2021-02-14 | 2 |
| 2021-02-15 | 2 |
| 2021-02-16 | 2 |
| 2021-02-17 | 2 |
| 2021-02-18 | 2 |
| 2021-02-19 | 2 |
| 2021-02-20 | 2 |
| 2021-02-21 | 2 |
| 2021-02-22 | 2 |
| 2021-02-23 | 2 |
| 2021-02-24 | 2 |
| 2021-02-25 | 2 |
| 2021-02-26 | 2 |
| 2021-02-27 | 2 |
| 2021-02-28 | 2 |
| 2021-03-01 | 2 |
| 2021-03-02 | 2 |
| 2021-03-03 | 2 |
| 2021-03-04 | 2 |
| 2021-03-05 | 2 |
| 2021-03-06 | 2 |
| 2021-03-07 | 2 |
| 2021-03-08 | 2 |
| 2021-03-09 | 2 |
| 2021-03-10 | 2 |
| 2021-03-11 | 2 |
| 2021-03-12 | 2 |
| 2021-03-13 | 2 |
| 2021-03-14 | 2 |
| 2021-03-15 | 2 |
| 2021-03-16 | 2 |
| 2021-03-17 | 2 |
| 2021-03-18 | 2.75 |
| 2021-03-19 | 2.75 |
| 2021-03-20 | 2.75 |
| 2021-03-21 | 2.75 |
| 2021-03-22 | 2.75 |
| 2021-03-23 | 2.75 |
| 2021-03-24 | 2.75 |
| 2021-03-25 | 2.75 |
| 2021-03-26 | 2.75 |
| 2021-03-27 | 2.75 |
| 2021-03-28 | 2.75 |
| 2021-03-29 | 2.75 |
| 2021-03-30 | 2.75 |
| 2021-03-31 | 2.75 |
| 2021-04-01 | 2.75 |
| 2021-04-02 | 2.75 |
| 2021-04-03 | 2.75 |
| 2021-04-04 | 2.75 |
| 2021-04-05 | 2.75 |
| 2021-04-06 | 2.75 |
| 2021-04-07 | 2.75 |
| 2021-04-08 | 2.75 |
| 2021-04-09 | 2.75 |
| 2021-04-10 | 2.75 |
| 2021-04-11 | 2.75 |
| 2021-04-12 | 2.75 |
| 2021-04-13 | 2.75 |
| 2021-04-14 | 2.75 |
| 2021-04-15 | 2.75 |
| 2021-04-16 | 2.75 |
| 2021-04-17 | 2.75 |
| 2021-04-18 | 2.75 |
| 2021-04-19 | 2.75 |
| 2021-04-20 | 2.75 |
| 2021-04-21 | 2.75 |
| 2021-04-22 | 2.75 |
| 2021-04-23 | 2.75 |
| 2021-04-24 | 2.75 |
| 2021-04-25 | 2.75 |
| 2021-04-26 | 2.75 |
| 2021-04-27 | 2.75 |
| 2021-04-28 | 2.75 |
| 2021-04-29 | 2.75 |
| 2021-04-30 | 2.75 |
| 2021-05-01 | 2.75 |
| 2021-05-02 | 2.75 |
| 2021-05-03 | 2.75 |
| 2021-05-04 | 2.75 |
| 2021-05-05 | 2.75 |
| 2021-05-06 | 3.5 |
| 2021-05-07 | 3.5 |
| 2021-05-08 | 3.5 |
| 2021-05-09 | 3.5 |
| 2021-05-10 | 3.5 |
| 2021-05-11 | 3.5 |
| 2021-05-12 | 3.5 |
| 2021-05-13 | 3.5 |
| 2021-05-14 | 3.5 |
| 2021-05-15 | 3.5 |
| 2021-05-16 | 3.5 |
| 2021-05-17 | 3.5 |
| 2021-05-18 | 3.5 |
| 2021-05-19 | 3.5 |
| 2021-05-20 | 3.5 |
| 2021-05-21 | 3.5 |
| 2021-05-22 | 3.5 |
| 2021-05-23 | 3.5 |
| 2021-05-24 | 3.5 |
| 2021-05-25 | 3.5 |
| 2021-05-26 | 3.5 |
| 2021-05-27 | 3.5 |
| 2021-05-28 | 3.5 |
| 2021-05-29 | 3.5 |
| 2021-05-30 | 3.5 |
| 2021-05-31 | 3.5 |
| 2021-06-01 | 3.5 |
| 2021-06-02 | 3.5 |
| 2021-06-03 | 3.5 |
| 2021-06-04 | 3.5 |
| 2021-06-05 | 3.5 |
| 2021-06-06 | 3.5 |
| 2021-06-07 | 3.5 |
| 2021-06-08 | 3.5 |
| 2021-06-09 | 3.5 |
| 2021-06-10 | 3.5 |
| 2021-06-11 | 3.5 |
| 2021-06-12 | 3.5 |
| 2021-06-13 | 3.5 |
| 2021-06-14 | 3.5 |
| 2021-06-15 | 3.5 |
| 2021-06-16 | 3.5 |
| 2021-06-17 | 4.25 |
| 2021-06-18 | 4.25 |
| 2021-06-19 | 4.25 |
| 2021-06-20 | 4.25 |
| 2021-06-21 | 4.25 |
| 2021-06-22 | 4.25 |
| 2021-06-23 | 4.25 |
| 2021-06-24 | 4.25 |
| 2021-06-25 | 4.25 |
| 2021-06-26 | 4.25 |
| 2021-06-27 | 4.25 |
| 2021-06-28 | 4.25 |
| 2021-06-29 | 4.25 |
| 2021-06-30 | 4.25 |
| 2021-07-01 | 4.25 |
| 2021-07-02 | 4.25 |
| 2021-07-03 | 4.25 |
| 2021-07-04 | 4.25 |
| 2021-07-05 | 4.25 |
| 2021-07-06 | 4.25 |
| 2021-07-07 | 4.25 |
| 2021-07-08 | 4.25 |
| 2021-07-09 | 4.25 |
| 2021-07-10 | 4.25 |
| 2021-07-11 | 4.25 |
| 2021-07-12 | 4.25 |
| 2021-07-13 | 4.25 |
| 2021-07-14 | 4.25 |
| 2021-07-15 | 4.25 |
| 2021-07-16 | 4.25 |
| 2021-07-17 | 4.25 |
| 2021-07-18 | 4.25 |
| 2021-07-19 | 4.25 |
| 2021-07-20 | 4.25 |
| 2021-07-21 | 4.25 |
| 2021-07-22 | 4.25 |
| 2021-07-23 | 4.25 |
| 2021-07-24 | 4.25 |
| 2021-07-25 | 4.25 |
| 2021-07-26 | 4.25 |
| 2021-07-27 | 4.25 |
| 2021-07-28 | 4.25 |
| 2021-07-29 | 4.25 |
| 2021-07-30 | 4.25 |
| 2021-07-31 | 4.25 |
| 2021-08-01 | 4.25 |
| 2021-08-02 | 4.25 |
| 2021-08-03 | 4.25 |
| 2021-08-04 | 4.25 |
| 2021-08-05 | 5.25 |
| 2021-08-06 | 5.25 |
| 2021-08-07 | 5.25 |
| 2021-08-08 | 5.25 |
| 2021-08-09 | 5.25 |
| 2021-08-10 | 5.25 |
| 2021-08-11 | 5.25 |
| 2021-08-12 | 5.25 |
| 2021-08-13 | 5.25 |
| 2021-08-14 | 5.25 |
| 2021-08-15 | 5.25 |
| 2021-08-16 | 5.25 |
| 2021-08-17 | 5.25 |
| 2021-08-18 | 5.25 |
| 2021-08-19 | 5.25 |
| 2021-08-20 | 5.25 |
| 2021-08-21 | 5.25 |
| 2021-08-22 | 5.25 |
| 2021-08-23 | 5.25 |
| 2021-08-24 | 5.25 |
| 2021-08-25 | 5.25 |
| 2021-08-26 | 5.25 |
| 2021-08-27 | 5.25 |
| 2021-08-28 | 5.25 |
| 2021-08-29 | 5.25 |
| 2021-08-30 | 5.25 |
| 2021-08-31 | 5.25 |
| 2021-09-01 | 5.25 |
| 2021-09-02 | 5.25 |
| 2021-09-03 | 5.25 |
| 2021-09-04 | 5.25 |
| 2021-09-05 | 5.25 |
| 2021-09-06 | 5.25 |
| 2021-09-07 | 5.25 |
| 2021-09-08 | 5.25 |
| 2021-09-09 | 5.25 |
| 2021-09-10 | 5.25 |
| 2021-09-11 | 5.25 |
| 2021-09-12 | 5.25 |
| 2021-09-13 | 5.25 |
| 2021-09-14 | 5.25 |
| 2021-09-15 | 5.25 |
| 2021-09-16 | 5.25 |
| 2021-09-17 | 5.25 |
| 2021-09-18 | 5.25 |
| 2021-09-19 | 5.25 |
| 2021-09-20 | 5.25 |
| 2021-09-21 | 5.25 |
| 2021-09-22 | 5.25 |
| 2021-09-23 | 6.25 |
| 2021-09-24 | 6.25 |
| 2021-09-25 | 6.25 |
| 2021-09-26 | 6.25 |
| 2021-09-27 | 6.25 |
| 2021-09-28 | 6.25 |
| 2021-09-29 | 6.25 |
| 2021-09-30 | 6.25 |
| 2021-10-01 | 6.25 |
| 2021-10-02 | 6.25 |
| 2021-10-03 | 6.25 |
| 2021-10-04 | 6.25 |
| 2021-10-05 | 6.25 |
| 2021-10-06 | 6.25 |
| 2021-10-07 | 6.25 |
| 2021-10-08 | 6.25 |
| 2021-10-09 | 6.25 |
| 2021-10-10 | 6.25 |
| 2021-10-11 | 6.25 |
| 2021-10-12 | 6.25 |
| 2021-10-13 | 6.25 |
| 2021-10-14 | 6.25 |
| 2021-10-15 | 6.25 |
| 2021-10-16 | 6.25 |
| 2021-10-17 | 6.25 |
| 2021-10-18 | 6.25 |
| 2021-10-19 | 6.25 |
| 2021-10-20 | 6.25 |
| 2021-10-21 | 6.25 |
| 2021-10-22 | 6.25 |
| 2021-10-23 | 6.25 |
| 2021-10-24 | 6.25 |
| 2021-10-25 | 6.25 |
| 2021-10-26 | 6.25 |
| 2021-10-27 | 6.25 |
| 2021-10-28 | 7.75 |
| 2021-10-29 | 7.75 |
| 2021-10-30 | 7.75 |
| 2021-10-31 | 7.75 |
| 2021-11-01 | 7.75 |
| 2021-11-02 | 7.75 |
| 2021-11-03 | 7.75 |
| 2021-11-04 | 7.75 |
| 2021-11-05 | 7.75 |
| 2021-11-06 | 7.75 |
| 2021-11-07 | 7.75 |
| 2021-11-08 | 7.75 |
| 2021-11-09 | 7.75 |
| 2021-11-10 | 7.75 |
| 2021-11-11 | 7.75 |
| 2021-11-12 | 7.75 |
| 2021-11-13 | 7.75 |
| 2021-11-14 | 7.75 |
| 2021-11-15 | 7.75 |
| 2021-11-16 | 7.75 |
| 2021-11-17 | 7.75 |
| 2021-11-18 | 7.75 |
| 2021-11-19 | 7.75 |
| 2021-11-20 | 7.75 |
| 2021-11-21 | 7.75 |
| 2021-11-22 | 7.75 |
| 2021-11-23 | 7.75 |
| 2021-11-24 | 7.75 |
| 2021-11-25 | 7.75 |
| 2021-11-26 | 7.75 |
| 2021-11-27 | 7.75 |
| 2021-11-28 | 7.75 |
| 2021-11-29 | 7.75 |
| 2021-11-30 | 7.75 |
| 2021-12-01 | 7.75 |
| 2021-12-02 | 7.75 |
| 2021-12-03 | 7.75 |
| 2021-12-04 | 7.75 |
| 2021-12-05 | 7.75 |
| 2021-12-06 | 7.75 |
| 2021-12-07 | 7.75 |
| 2021-12-08 | 7.75 |
| 2021-12-09 | 9.25 |
| 2021-12-10 | 9.25 |
| 2021-12-11 | 9.25 |
| 2021-12-12 | 9.25 |
| 2021-12-13 | 9.25 |
| 2021-12-14 | 9.25 |
| 2021-12-15 | 9.25 |
| 2021-12-16 | 9.25 |
| 2021-12-17 | 9.25 |
| 2021-12-18 | 9.25 |
| 2021-12-19 | 9.25 |
| 2021-12-20 | 9.25 |
| 2021-12-21 | 9.25 |
| 2021-12-22 | 9.25 |
| 2021-12-23 | 9.25 |
| 2021-12-24 | 9.25 |
| 2021-12-25 | 9.25 |
| 2021-12-26 | 9.25 |
| 2021-12-27 | 9.25 |
| 2021-12-28 | 9.25 |
| 2021-12-29 | 9.25 |
| 2021-12-30 | 9.25 |
| 2021-12-31 | 9.25 |
| 2022-01-01 | 9.25 |
| 2022-01-02 | 9.25 |
| 2022-01-03 | 9.25 |
| 2022-01-04 | 9.25 |
| 2022-01-05 | 9.25 |
| 2022-01-06 | 9.25 |
| 2022-01-07 | 9.25 |
| 2022-01-08 | 9.25 |
| 2022-01-09 | 9.25 |
| 2022-01-10 | 9.25 |
| 2022-01-11 | 9.25 |
| 2022-01-12 | 9.25 |
| 2022-01-13 | 9.25 |
| 2022-01-14 | 9.25 |
| 2022-01-15 | 9.25 |
| 2022-01-16 | 9.25 |
| 2022-01-17 | 9.25 |
| 2022-01-18 | 9.25 |
| 2022-01-19 | 9.25 |
| 2022-01-20 | 9.25 |
| 2022-01-21 | 9.25 |
| 2022-01-22 | 9.25 |
| 2022-01-23 | 9.25 |
| 2022-01-24 | 9.25 |
| 2022-01-25 | 9.25 |
| 2022-01-26 | 9.25 |
| 2022-01-27 | 9.25 |
| 2022-01-28 | 9.25 |
| 2022-01-29 | 9.25 |
| 2022-01-30 | 9.25 |
| 2022-01-31 | 9.25 |
| 2022-02-01 | 9.25 |
| 2022-02-02 | 9.25 |
| 2022-02-03 | 10.75 |
| 2022-02-04 | 10.75 |
| 2022-02-05 | 10.75 |
| 2022-02-06 | 10.75 |
| 2022-02-07 | 10.75 |
| 2022-02-08 | 10.75 |
| 2022-02-09 | 10.75 |
| 2022-02-10 | 10.75 |
| 2022-02-11 | 10.75 |
| 2022-02-12 | 10.75 |
| 2022-02-13 | 10.75 |
| 2022-02-14 | 10.75 |
| 2022-02-15 | 10.75 |
| 2022-02-16 | 10.75 |
| 2022-02-17 | 10.75 |
| 2022-02-18 | 10.75 |
| 2022-02-19 | 10.75 |
| 2022-02-20 | 10.75 |
| 2022-02-21 | 10.75 |
| 2022-02-22 | 10.75 |
| 2022-02-23 | 10.75 |
| 2022-02-24 | 10.75 |
| 2022-02-25 | 10.75 |
| 2022-02-26 | 10.75 |
| 2022-02-27 | 10.75 |
| 2022-02-28 | 10.75 |
| 2022-03-01 | 10.75 |
| 2022-03-02 | 10.75 |
| 2022-03-03 | 10.75 |
| 2022-03-04 | 10.75 |
| 2022-03-05 | 10.75 |
| 2022-03-06 | 10.75 |
| 2022-03-07 | 10.75 |
| 2022-03-08 | 10.75 |
| 2022-03-09 | 10.75 |
| 2022-03-10 | 10.75 |
| 2022-03-11 | 10.75 |
| 2022-03-12 | 10.75 |
| 2022-03-13 | 10.75 |
| 2022-03-14 | 10.75 |
| 2022-03-15 | 10.75 |
| 2022-03-16 | 10.75 |
| 2022-03-17 | 11.75 |
| 2022-03-18 | 11.75 |
| 2022-03-19 | 11.75 |
| 2022-03-20 | 11.75 |
| 2022-03-21 | 11.75 |
| 2022-03-22 | 11.75 |
| 2022-03-23 | 11.75 |
| 2022-03-24 | 11.75 |
| 2022-03-25 | 11.75 |
| 2022-03-26 | 11.75 |
| 2022-03-27 | 11.75 |
| 2022-03-28 | 11.75 |
| 2022-03-29 | 11.75 |
| 2022-03-30 | 11.75 |
| 2022-03-31 | 11.75 |
| 2022-04-01 | 11.75 |
| 2022-04-02 | 11.75 |
| 2022-04-03 | 11.75 |
| 2022-04-04 | 11.75 |
| 2022-04-05 | 11.75 |
| 2022-04-06 | 11.75 |
| 2022-04-07 | 11.75 |
| 2022-04-08 | 11.75 |
| 2022-04-09 | 11.75 |
| 2022-04-10 | 11.75 |
| 2022-04-11 | 11.75 |
| 2022-04-12 | 11.75 |
| 2022-04-13 | 11.75 |
| 2022-04-14 | 11.75 |
| 2022-04-15 | 11.75 |
| 2022-04-16 | 11.75 |
| 2022-04-17 | 11.75 |
| 2022-04-18 | 11.75 |
| 2022-04-19 | 11.75 |
| 2022-04-20 | 11.75 |
| 2022-04-21 | 11.75 |
| 2022-04-22 | 11.75 |
| 2022-04-23 | 11.75 |
| 2022-04-24 | 11.75 |
| 2022-04-25 | 11.75 |
| 2022-04-26 | 11.75 |
| 2022-04-27 | 11.75 |
| 2022-04-28 | 11.75 |
| 2022-04-29 | 11.75 |
| 2022-04-30 | 11.75 |
| 2022-05-01 | 11.75 |
| 2022-05-02 | 11.75 |
| 2022-05-03 | 11.75 |
| 2022-05-04 | 11.75 |
| 2022-05-05 | 12.75 |
| 2022-05-06 | 12.75 |
| 2022-05-07 | 12.75 |
| 2022-05-08 | 12.75 |
| 2022-05-09 | 12.75 |
| 2022-05-10 | 12.75 |
| 2022-05-11 | 12.75 |
| 2022-05-12 | 12.75 |
| 2022-05-13 | 12.75 |
| 2022-05-14 | 12.75 |
| 2022-05-15 | 12.75 |
| 2022-05-16 | 12.75 |
| 2022-05-17 | 12.75 |
| 2022-05-18 | 12.75 |
| 2022-05-19 | 12.75 |
| 2022-05-20 | 12.75 |
| 2022-05-21 | 12.75 |
| 2022-05-22 | 12.75 |
| 2022-05-23 | 12.75 |
| 2022-05-24 | 12.75 |
| 2022-05-25 | 12.75 |
| 2022-05-26 | 12.75 |
| 2022-05-27 | 12.75 |
| 2022-05-28 | 12.75 |
| 2022-05-29 | 12.75 |
| 2022-05-30 | 12.75 |
| 2022-05-31 | 12.75 |
| 2022-06-01 | 12.75 |
| 2022-06-02 | 12.75 |
| 2022-06-03 | 12.75 |
| 2022-06-04 | 12.75 |
| 2022-06-05 | 12.75 |
| 2022-06-06 | 12.75 |
| 2022-06-07 | 12.75 |
| 2022-06-08 | 12.75 |
| 2022-06-09 | 12.75 |
| 2022-06-10 | 12.75 |
| 2022-06-11 | 12.75 |
| 2022-06-12 | 12.75 |
| 2022-06-13 | 12.75 |
| 2022-06-14 | 12.75 |
| 2022-06-15 | 12.75 |
| 2022-06-16 | 13.25 |
| 2022-06-17 | 13.25 |
| 2022-06-18 | 13.25 |
| 2022-06-19 | 13.25 |
| 2022-06-20 | 13.25 |
| 2022-06-21 | 13.25 |
| 2022-06-22 | 13.25 |
| 2022-06-23 | 13.25 |
| 2022-06-24 | 13.25 |
| 2022-06-25 | 13.25 |
| 2022-06-26 | 13.25 |
| 2022-06-27 | 13.25 |
| 2022-06-28 | 13.25 |
| 2022-06-29 | 13.25 |
| 2022-06-30 | 13.25 |
| 2022-07-01 | 13.25 |
| 2022-07-02 | 13.25 |
| 2022-07-03 | 13.25 |
| 2022-07-04 | 13.25 |
| 2022-07-05 | 13.25 |
| 2022-07-06 | 13.25 |
| 2022-07-07 | 13.25 |
| 2022-07-08 | 13.25 |
| 2022-07-09 | 13.25 |
| 2022-07-10 | 13.25 |
| 2022-07-11 | 13.25 |
| 2022-07-12 | 13.25 |
| 2022-07-13 | 13.25 |
| 2022-07-14 | 13.25 |
| 2022-07-15 | 13.25 |
| 2022-07-16 | 13.25 |
| 2022-07-17 | 13.25 |
| 2022-07-18 | 13.25 |
| 2022-07-19 | 13.25 |
| 2022-07-20 | 13.25 |
| 2022-07-21 | 13.25 |
| 2022-07-22 | 13.25 |
| 2022-07-23 | 13.25 |
| 2022-07-24 | 13.25 |
| 2022-07-25 | 13.25 |
| 2022-07-26 | 13.25 |
| 2022-07-27 | 13.25 |
| 2022-07-28 | 13.25 |
| 2022-07-29 | 13.25 |
| 2022-07-30 | 13.25 |
| 2022-07-31 | 13.25 |
| 2022-08-01 | 13.25 |
| 2022-08-02 | 13.25 |
| 2022-08-03 | 13.25 |
| 2022-08-04 | 13.75 |
| 2022-08-05 | 13.75 |
| 2022-08-06 | 13.75 |
| 2022-08-07 | 13.75 |
| 2022-08-08 | 13.75 |
| 2022-08-09 | 13.75 |
| 2022-08-10 | 13.75 |
| 2022-08-11 | 13.75 |
| 2022-08-12 | 13.75 |
| 2022-08-13 | 13.75 |
| 2022-08-14 | 13.75 |
| 2022-08-15 | 13.75 |
| 2022-08-16 | 13.75 |
| 2022-08-17 | 13.75 |
| 2022-08-18 | 13.75 |
| 2022-08-19 | 13.75 |
| 2022-08-20 | 13.75 |
| 2022-08-21 | 13.75 |
| 2022-08-22 | 13.75 |
| 2022-08-23 | 13.75 |
| 2022-08-24 | 13.75 |
| 2022-08-25 | 13.75 |
| 2022-08-26 | 13.75 |
| 2022-08-27 | 13.75 |
| 2022-08-28 | 13.75 |
| 2022-08-29 | 13.75 |
| 2022-08-30 | 13.75 |
| 2022-08-31 | 13.75 |
| 2022-09-01 | 13.75 |
| 2022-09-02 | 13.75 |
| 2022-09-03 | 13.75 |
| 2022-09-04 | 13.75 |
| 2022-09-05 | 13.75 |
| 2022-09-06 | 13.75 |
| 2022-09-07 | 13.75 |
| 2022-09-08 | 13.75 |
| 2022-09-09 | 13.75 |
| 2022-09-10 | 13.75 |
| 2022-09-11 | 13.75 |
| 2022-09-12 | 13.75 |
| 2022-09-13 | 13.75 |
| 2022-09-14 | 13.75 |
| 2022-09-15 | 13.75 |
| 2022-09-16 | 13.75 |
| 2022-09-17 | 13.75 |
| 2022-09-18 | 13.75 |
| 2022-09-19 | 13.75 |
| 2022-09-20 | 13.75 |
| 2022-09-21 | 13.75 |
| 2022-09-22 | 13.75 |
| 2022-09-23 | 13.75 |
| 2022-09-24 | 13.75 |
| 2022-09-25 | 13.75 |
| 2022-09-26 | 13.75 |
| 2022-09-27 | 13.75 |
| 2022-09-28 | 13.75 |
| 2022-09-29 | 13.75 |
| 2022-09-30 | 13.75 |
| 2022-10-01 | 13.75 |
| 2022-10-02 | 13.75 |
| 2022-10-03 | 13.75 |
| 2022-10-04 | 13.75 |
| 2022-10-05 | 13.75 |
| 2022-10-06 | 13.75 |
| 2022-10-07 | 13.75 |
| 2022-10-08 | 13.75 |
| 2022-10-09 | 13.75 |
| 2022-10-10 | 13.75 |
| 2022-10-11 | 13.75 |
| 2022-10-12 | 13.75 |
| 2022-10-13 | 13.75 |
| 2022-10-14 | 13.75 |
| 2022-10-15 | 13.75 |
| 2022-10-16 | 13.75 |
| 2022-10-17 | 13.75 |
| 2022-10-18 | 13.75 |
| 2022-10-19 | 13.75 |
| 2022-10-20 | 13.75 |
| 2022-10-21 | 13.75 |
| 2022-10-22 | 13.75 |
| 2022-10-23 | 13.75 |
| 2022-10-24 | 13.75 |
| 2022-10-25 | 13.75 |
| 2022-10-26 | 13.75 |
| 2022-10-27 | 13.75 |
| 2022-10-28 | 13.75 |
| 2022-10-29 | 13.75 |
| 2022-10-30 | 13.75 |
| 2022-10-31 | 13.75 |
| 2022-11-01 | 13.75 |
| 2022-11-02 | 13.75 |
| 2022-11-03 | 13.75 |
| 2022-11-04 | 13.75 |
| 2022-11-05 | 13.75 |
| 2022-11-06 | 13.75 |
| 2022-11-07 | 13.75 |
| 2022-11-08 | 13.75 |
| 2022-11-09 | 13.75 |
| 2022-11-10 | 13.75 |
| 2022-11-11 | 13.75 |
| 2022-11-12 | 13.75 |
| 2022-11-13 | 13.75 |
| 2022-11-14 | 13.75 |
| 2022-11-15 | 13.75 |
| 2022-11-16 | 13.75 |
| 2022-11-17 | 13.75 |
| 2022-11-18 | 13.75 |
| 2022-11-19 | 13.75 |
| 2022-11-20 | 13.75 |
| 2022-11-21 | 13.75 |
| 2022-11-22 | 13.75 |
| 2022-11-23 | 13.75 |
| 2022-11-24 | 13.75 |
| 2022-11-25 | 13.75 |
| 2022-11-26 | 13.75 |
| 2022-11-27 | 13.75 |
| 2022-11-28 | 13.75 |
| 2022-11-29 | 13.75 |
| 2022-11-30 | 13.75 |
| 2022-12-01 | 13.75 |
| 2022-12-02 | 13.75 |
| 2022-12-03 | 13.75 |
| 2022-12-04 | 13.75 |
| 2022-12-05 | 13.75 |
| 2022-12-06 | 13.75 |
| 2022-12-07 | 13.75 |
| 2022-12-08 | 13.75 |
| 2022-12-09 | 13.75 |
| 2022-12-10 | 13.75 |
| 2022-12-11 | 13.75 |
| 2022-12-12 | 13.75 |
| 2022-12-13 | 13.75 |
| 2022-12-14 | 13.75 |
| 2022-12-15 | 13.75 |
| 2022-12-16 | 13.75 |
| 2022-12-17 | 13.75 |
| 2022-12-18 | 13.75 |
| 2022-12-19 | 13.75 |
| 2022-12-20 | 13.75 |
| 2022-12-21 | 13.75 |
| 2022-12-22 | 13.75 |
| 2022-12-23 | 13.75 |
| 2022-12-24 | 13.75 |
| 2022-12-25 | 13.75 |
| 2022-12-26 | 13.75 |
| 2022-12-27 | 13.75 |
| 2022-12-28 | 13.75 |
| 2022-12-29 | 13.75 |
| 2022-12-30 | 13.75 |
| 2022-12-31 | 13.75 |
| 2023-01-01 | 13.75 |
| 2023-01-02 | 13.75 |
| 2023-01-03 | 13.75 |
| 2023-01-04 | 13.75 |
| 2023-01-05 | 13.75 |
| 2023-01-06 | 13.75 |
| 2023-01-07 | 13.75 |
| 2023-01-08 | 13.75 |
| 2023-01-09 | 13.75 |
| 2023-01-10 | 13.75 |
| 2023-01-11 | 13.75 |
| 2023-01-12 | 13.75 |
| 2023-01-13 | 13.75 |
| 2023-01-14 | 13.75 |
| 2023-01-15 | 13.75 |
| 2023-01-16 | 13.75 |
| 2023-01-17 | 13.75 |
| 2023-01-18 | 13.75 |
| 2023-01-19 | 13.75 |
| 2023-01-20 | 13.75 |
| 2023-01-21 | 13.75 |
| 2023-01-22 | 13.75 |
| 2023-01-23 | 13.75 |
| 2023-01-24 | 13.75 |
| 2023-01-25 | 13.75 |
| 2023-01-26 | 13.75 |
| 2023-01-27 | 13.75 |
| 2023-01-28 | 13.75 |
| 2023-01-29 | 13.75 |
| 2023-01-30 | 13.75 |
| 2023-01-31 | 13.75 |
| 2023-02-01 | 13.75 |
| 2023-02-02 | 13.75 |
| 2023-02-03 | 13.75 |
| 2023-02-04 | 13.75 |
| 2023-02-05 | 13.75 |
| 2023-02-06 | 13.75 |
| 2023-02-07 | 13.75 |
| 2023-02-08 | 13.75 |
| 2023-02-09 | 13.75 |
| 2023-02-10 | 13.75 |
| 2023-02-11 | 13.75 |
| 2023-02-12 | 13.75 |
| 2023-02-13 | 13.75 |
| 2023-02-14 | 13.75 |
| 2023-02-15 | 13.75 |
| 2023-02-16 | 13.75 |
| 2023-02-17 | 13.75 |
| 2023-02-18 | 13.75 |
| 2023-02-19 | 13.75 |
| 2023-02-20 | 13.75 |
| 2023-02-21 | 13.75 |
| 2023-02-22 | 13.75 |
| 2023-02-23 | 13.75 |
| 2023-02-24 | 13.75 |
| 2023-02-25 | 13.75 |
| 2023-02-26 | 13.75 |
| 2023-02-27 | 13.75 |
| 2023-02-28 | 13.75 |
| 2023-03-01 | 13.75 |
| 2023-03-02 | 13.75 |
| 2023-03-03 | 13.75 |
| 2023-03-04 | 13.75 |
| 2023-03-05 | 13.75 |
| 2023-03-06 | 13.75 |
| 2023-03-07 | 13.75 |
| 2023-03-08 | 13.75 |
| 2023-03-09 | 13.75 |
| 2023-03-10 | 13.75 |
| 2023-03-11 | 13.75 |
| 2023-03-12 | 13.75 |
| 2023-03-13 | 13.75 |
| 2023-03-14 | 13.75 |
| 2023-03-15 | 13.75 |
| 2023-03-16 | 13.75 |
| 2023-03-17 | 13.75 |
| 2023-03-18 | 13.75 |
| 2023-03-19 | 13.75 |
| 2023-03-20 | 13.75 |
| 2023-03-21 | 13.75 |
| 2023-03-22 | 13.75 |
| 2023-03-23 | 13.75 |